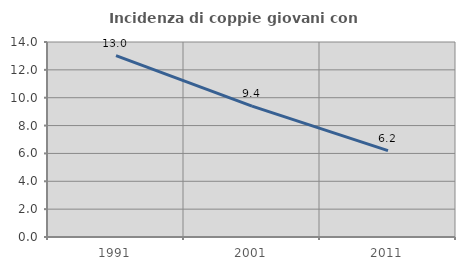
| Category | Incidenza di coppie giovani con figli |
|---|---|
| 1991.0 | 13.029 |
| 2001.0 | 9.396 |
| 2011.0 | 6.206 |